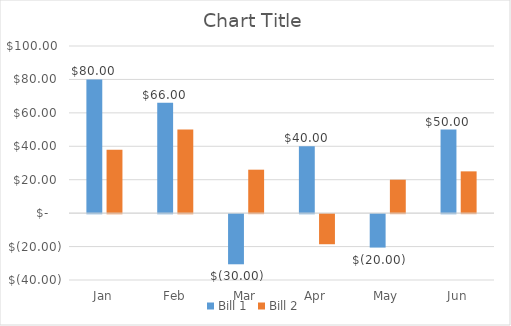
| Category | Bill 1 | Bill 2 |
|---|---|---|
| Jan | 80 | 38 |
| Feb | 66 | 50 |
| Mar | -30 | 26 |
| Apr | 40 | -18 |
| May | -20 | 20 |
| Jun | 50 | 25 |